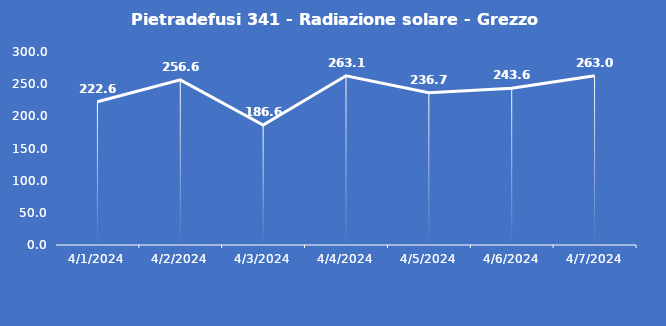
| Category | Pietradefusi 341 - Radiazione solare - Grezzo (W/m2) |
|---|---|
| 4/1/24 | 222.6 |
| 4/2/24 | 256.6 |
| 4/3/24 | 186.6 |
| 4/4/24 | 263.1 |
| 4/5/24 | 236.7 |
| 4/6/24 | 243.6 |
| 4/7/24 | 263 |